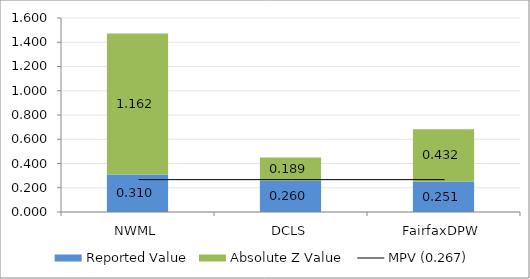
| Category | Reported Value | Absolute Z Value  |
|---|---|---|
| NWML | 0.31 | 1.162 |
| DCLS | 0.26 | 0.189 |
| FairfaxDPW | 0.251 | 0.432 |